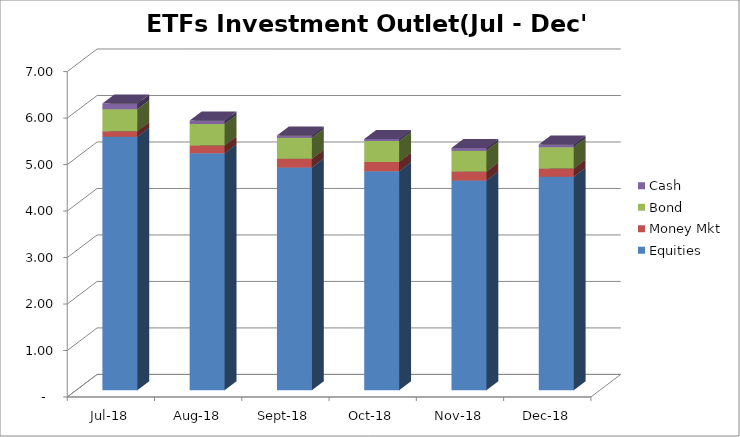
| Category | Equities | Money Mkt | Bond | Cash |
|---|---|---|---|---|
| 2018-07-01 | 5450573222.74 | 120602888.23 | 474827704.85 | 119719492.83 |
| 2018-08-01 | 5095492053.52 | 171301483.56 | 457917264.22 | 74763035.01 |
| 2018-09-01 | 4792209737.37 | 184959940.49 | 453943790.42 | 50103376.74 |
| 2018-10-01 | 4710183549.74 | 201812628.7 | 448435810.88 | 45392103.41 |
| 2018-11-01 | 4511471490.81 | 192561506.44 | 449623716.37 | 56722794.06 |
| 2018-12-01 | 4593226725.97 | 177224498.42 | 455822889.82 | 58868504.36 |